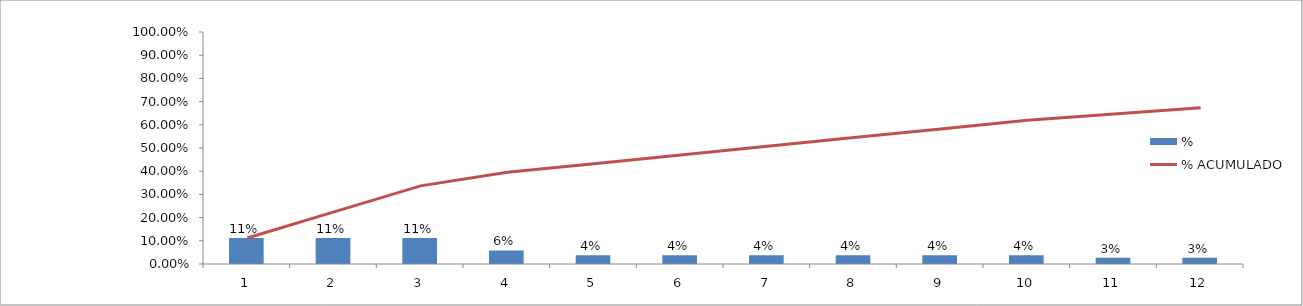
| Category | % |
|---|---|
| 0 | 0.112 |
| 1 | 0.112 |
| 2 | 0.112 |
| 3 | 0.058 |
| 4 | 0.037 |
| 5 | 0.037 |
| 6 | 0.037 |
| 7 | 0.037 |
| 8 | 0.037 |
| 9 | 0.037 |
| 10 | 0.027 |
| 11 | 0.027 |